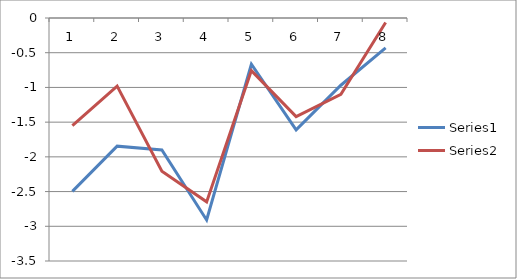
| Category | Series 0 | Series 1 |
|---|---|---|
| 0 | -2.497 | -1.552 |
| 1 | -1.846 | -0.981 |
| 2 | -1.901 | -2.206 |
| 3 | -2.909 | -2.648 |
| 4 | -0.666 | -0.758 |
| 5 | -1.61 | -1.42 |
| 6 | -0.968 | -1.101 |
| 7 | -0.43 | -0.066 |